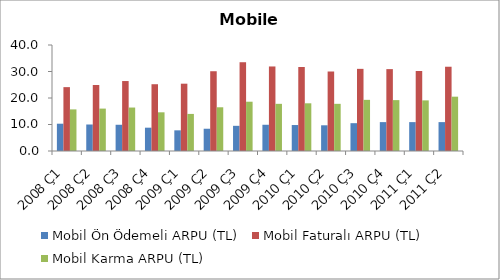
| Category | Mobil Ön Ödemeli ARPU (TL) | Mobil Faturalı ARPU (TL) | Mobil Karma ARPU (TL) |
|---|---|---|---|
| 2008 Ç1 | 10.3 | 24.1 | 15.7 |
| 2008 Ç2 | 10 | 24.9 | 16 |
| 2008 Ç3 | 9.9 | 26.4 | 16.4 |
| 2008 Ç4 | 8.8 | 25.2 | 14.6 |
| 2009 Ç1 | 7.8 | 25.4 | 13.991 |
| 2009 Ç2 | 8.4 | 30.1 | 16.5 |
| 2009 Ç3 | 9.5 | 33.5 | 18.6 |
| 2009 Ç4 | 9.9 | 31.9 | 17.8 |
| 2010 Ç1 | 9.8 | 31.7 | 18 |
| 2010 Ç2 | 9.7 | 30 | 17.8 |
| 2010 Ç3 | 10.5 | 31 | 19.3 |
| 2010 Ç4 | 10.9 | 30.9 | 19.2 |
| 2011 Ç1 | 10.9 | 30.2 | 19.1 |
| 2011 Ç2 | 10.9 | 31.8 | 20.5 |